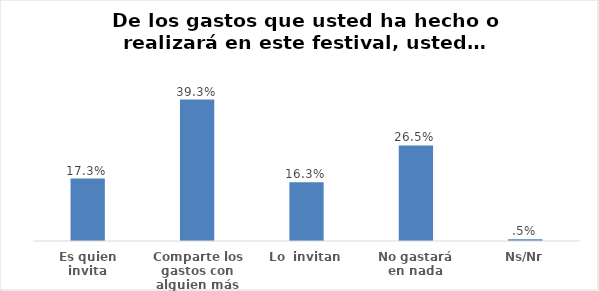
| Category | Series 0 |
|---|---|
| Es quien invita | 0.173 |
| Comparte los gastos con alguien más | 0.393 |
| Lo  invitan | 0.163 |
| No gastará en nada | 0.265 |
| Ns/Nr | 0.005 |